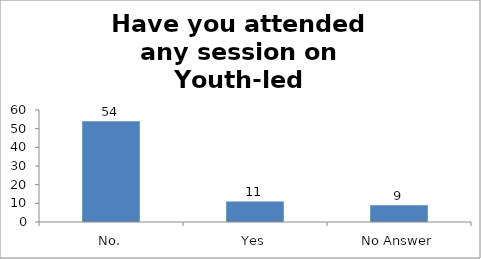
| Category | Have you attended any session on Youth-led Changemaking before? |
|---|---|
| No. | 54 |
| Yes | 11 |
| No Answer | 9 |